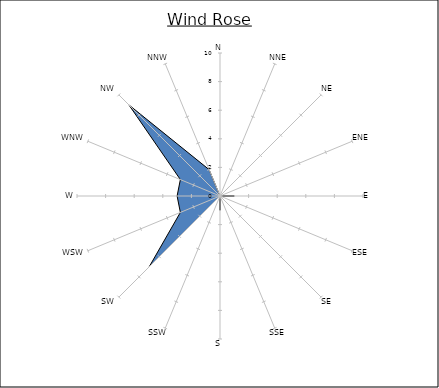
| Category | Series 0 |
|---|---|
| N | 0 |
| NNE | 0 |
| NE | 1 |
| ENE | 0 |
| E | 1 |
| ESE | 0 |
| SE | 1 |
| SSE | 0 |
| S | 1 |
| SSW | 0 |
| SW | 7 |
| WSW | 3 |
| W | 3 |
| WNW | 3 |
| NW | 9 |
| NNW | 2 |